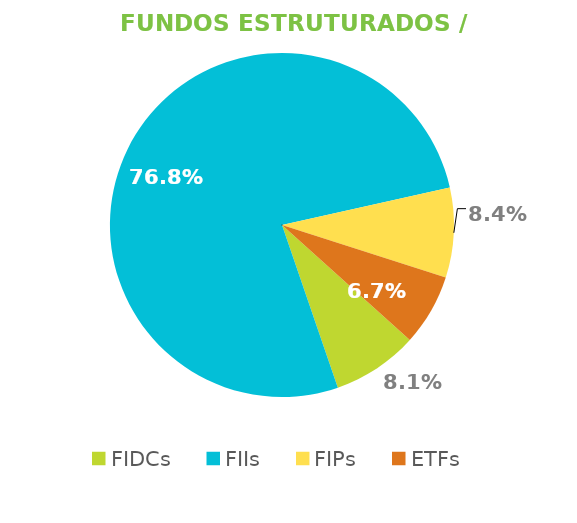
| Category | Fundos Estruturados / ETFs |
|---|---|
| FIDCs | 0.081 |
| FIIs | 0.768 |
| FIPs | 0.084 |
| ETFs | 0.067 |